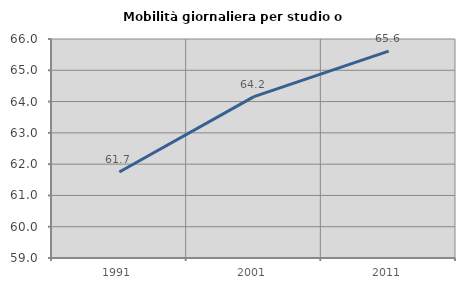
| Category | Mobilità giornaliera per studio o lavoro |
|---|---|
| 1991.0 | 61.75 |
| 2001.0 | 64.157 |
| 2011.0 | 65.613 |